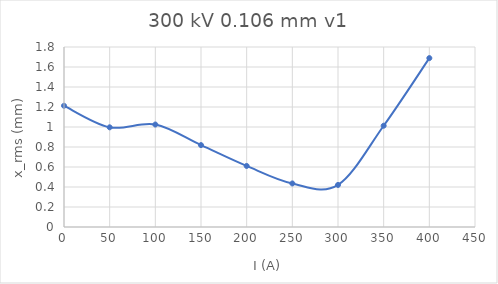
| Category | Series 0 |
|---|---|
| 0.0 | 1.212 |
| 50.0 | 0.997 |
| 100.0 | 1.025 |
| 150.0 | 0.819 |
| 200.0 | 0.61 |
| 250.0 | 0.436 |
| 300.0 | 0.421 |
| 350.0 | 1.013 |
| 400.0 | 1.689 |